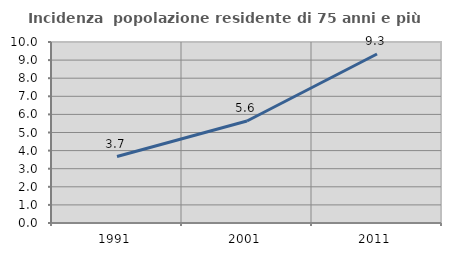
| Category | Incidenza  popolazione residente di 75 anni e più |
|---|---|
| 1991.0 | 3.673 |
| 2001.0 | 5.634 |
| 2011.0 | 9.337 |